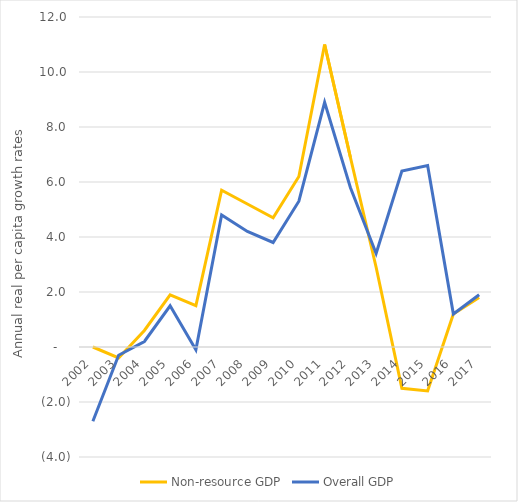
| Category | Non-resource GDP | Overall GDP |
|---|---|---|
| 2002.0 | 0 | -2.7 |
| 2003.0 | -0.4 | -0.3 |
| 2004.0 | 0.6 | 0.2 |
| 2005.0 | 1.9 | 1.5 |
| 2006.0 | 1.5 | -0.1 |
| 2007.0 | 5.7 | 4.8 |
| 2008.0 | 5.2 | 4.2 |
| 2009.0 | 4.7 | 3.8 |
| 2010.0 | 6.2 | 5.3 |
| 2011.0 | 11 | 8.9 |
| 2012.0 | 6.9 | 5.8 |
| 2013.0 | 2.9 | 3.4 |
| 2014.0 | -1.5 | 6.4 |
| 2015.0 | -1.6 | 6.6 |
| 2016.0 | 1.2 | 1.2 |
| 2017.0 | 1.8 | 1.9 |